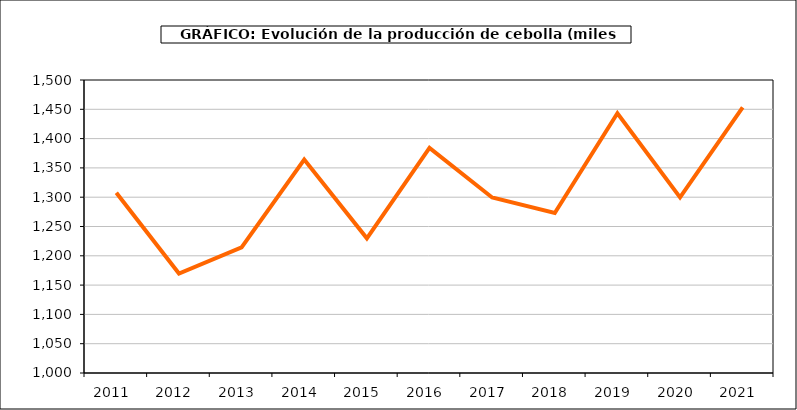
| Category | producción |
|---|---|
| 2011.0 | 1307.531 |
| 2012.0 | 1169.721 |
| 2013.0 | 1214.501 |
| 2014.0 | 1364.117 |
| 2015.0 | 1229.842 |
| 2016.0 | 1384.098 |
| 2017.0 | 1299.534 |
| 2018.0 | 1272.928 |
| 2019.0 | 1443.187 |
| 2020.0 | 1299.723 |
| 2021.0 | 1453.415 |